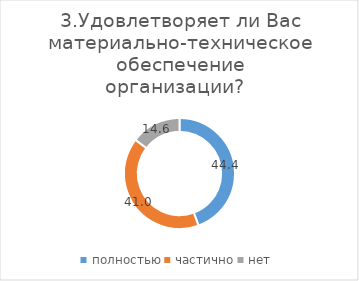
| Category | Series 0 |
|---|---|
| полностью | 44.444 |
| частично | 40.972 |
| нет | 14.583 |